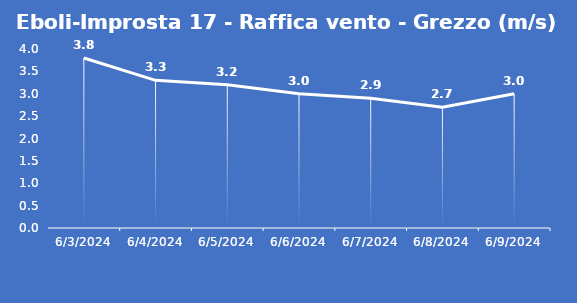
| Category | Eboli-Improsta 17 - Raffica vento - Grezzo (m/s) |
|---|---|
| 6/3/24 | 3.8 |
| 6/4/24 | 3.3 |
| 6/5/24 | 3.2 |
| 6/6/24 | 3 |
| 6/7/24 | 2.9 |
| 6/8/24 | 2.7 |
| 6/9/24 | 3 |